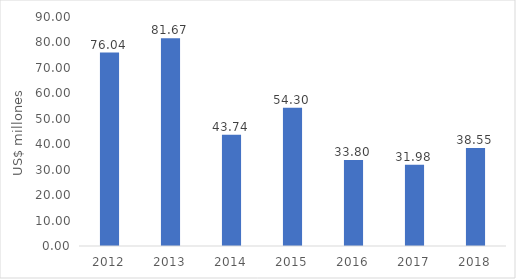
| Category | Series 0 |
|---|---|
| 2012.0 | 76.042 |
| 2013.0 | 81.671 |
| 2014.0 | 43.744 |
| 2015.0 | 54.296 |
| 2016.0 | 33.796 |
| 2017.0 | 31.98 |
| 2018.0 | 38.55 |